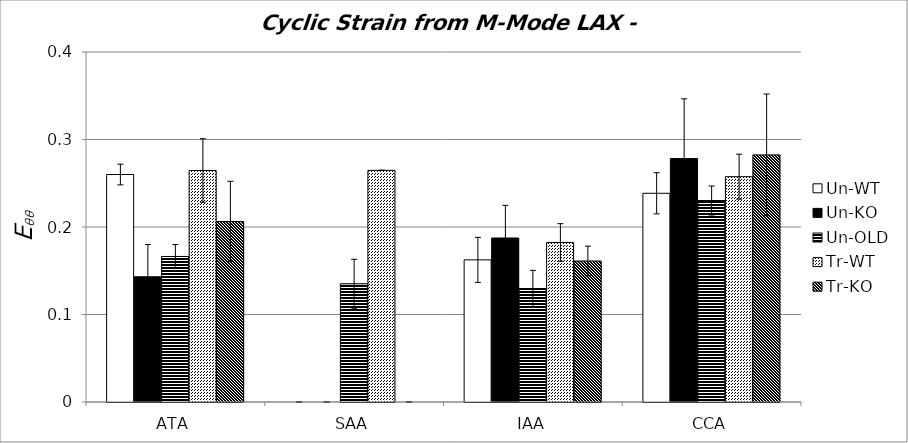
| Category | Un-WT | Un-KO | Un-OLD | Tr-WT | Tr-KO |
|---|---|---|---|---|---|
| 0 | 0.26 | 0.143 | 0.166 | 0.265 | 0.206 |
| 1 | 0 | 0 | 0.135 | 0.265 | 0 |
| 2 | 0.162 | 0.187 | 0.13 | 0.182 | 0.161 |
| 3 | 0.239 | 0.278 | 0.23 | 0.258 | 0.282 |